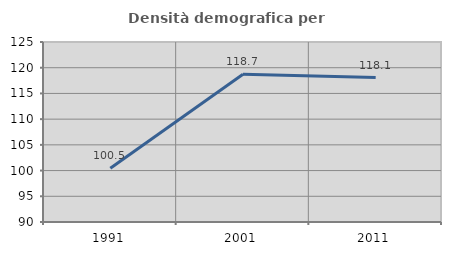
| Category | Densità demografica |
|---|---|
| 1991.0 | 100.465 |
| 2001.0 | 118.732 |
| 2011.0 | 118.094 |